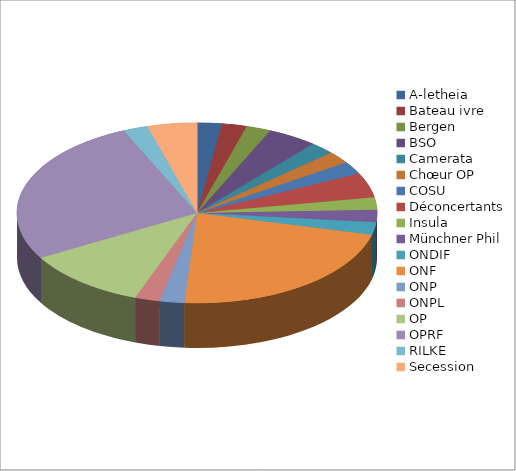
| Category | Series 0 |
|---|---|
| A-letheia | 1 |
| Bateau ivre | 1 |
| Bergen | 1 |
| BSO | 2 |
| Camerata | 1 |
| Chœur OP | 1 |
| COSU | 1 |
| Déconcertants | 2 |
| Insula | 1 |
| Münchner Phil | 1 |
| ONDIF | 1 |
| ONF | 10 |
| ONP | 1 |
| ONPL | 1 |
| OP | 5 |
| OPRF | 12 |
| RILKE | 1 |
| Secession | 2 |